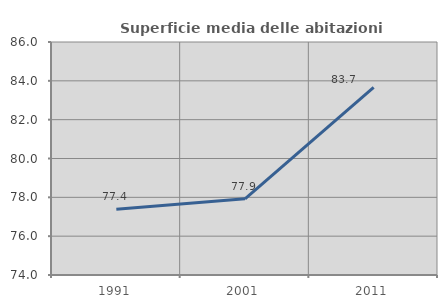
| Category | Superficie media delle abitazioni occupate |
|---|---|
| 1991.0 | 77.387 |
| 2001.0 | 77.922 |
| 2011.0 | 83.66 |